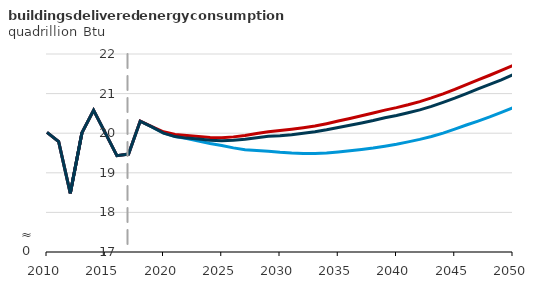
| Category | New efficiency requirements | No new efficiency requirements | Reference |
|---|---|---|---|
| 2010.0 | 20.02 | 20.02 | 20.02 |
| 2011.0 | 19.787 | 19.787 | 19.787 |
| 2012.0 | 18.482 | 18.482 | 18.482 |
| 2013.0 | 20.012 | 20.012 | 20.012 |
| 2014.0 | 20.578 | 20.578 | 20.578 |
| 2015.0 | 20.008 | 20.008 | 20.008 |
| 2016.0 | 19.431 | 19.431 | 19.431 |
| 2017.0 | 19.472 | 19.472 | 19.472 |
| 2018.0 | 20.307 | 20.306 | 20.302 |
| 2019.0 | 20.161 | 20.166 | 20.158 |
| 2020.0 | 20.006 | 20.036 | 20.003 |
| 2021.0 | 19.917 | 19.966 | 19.915 |
| 2022.0 | 19.865 | 19.941 | 19.876 |
| 2023.0 | 19.802 | 19.916 | 19.851 |
| 2024.0 | 19.741 | 19.892 | 19.823 |
| 2025.0 | 19.689 | 19.885 | 19.81 |
| 2026.0 | 19.63 | 19.907 | 19.82 |
| 2027.0 | 19.585 | 19.944 | 19.845 |
| 2028.0 | 19.563 | 19.99 | 19.884 |
| 2029.0 | 19.544 | 20.038 | 19.92 |
| 2030.0 | 19.517 | 20.066 | 19.938 |
| 2031.0 | 19.5 | 20.099 | 19.963 |
| 2032.0 | 19.49 | 20.139 | 19.997 |
| 2033.0 | 19.489 | 20.182 | 20.035 |
| 2034.0 | 19.502 | 20.241 | 20.086 |
| 2035.0 | 19.527 | 20.307 | 20.144 |
| 2036.0 | 19.555 | 20.373 | 20.202 |
| 2037.0 | 19.588 | 20.439 | 20.26 |
| 2038.0 | 19.627 | 20.508 | 20.321 |
| 2039.0 | 19.673 | 20.583 | 20.39 |
| 2040.0 | 19.723 | 20.646 | 20.447 |
| 2041.0 | 19.781 | 20.718 | 20.515 |
| 2042.0 | 19.845 | 20.798 | 20.589 |
| 2043.0 | 19.917 | 20.891 | 20.678 |
| 2044.0 | 20.002 | 20.992 | 20.78 |
| 2045.0 | 20.101 | 21.104 | 20.887 |
| 2046.0 | 20.207 | 21.225 | 21.002 |
| 2047.0 | 20.307 | 21.346 | 21.12 |
| 2048.0 | 20.41 | 21.463 | 21.234 |
| 2049.0 | 20.523 | 21.586 | 21.349 |
| 2050.0 | 20.641 | 21.714 | 21.475 |